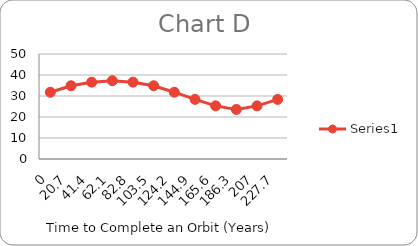
| Category | Series 0 |
|---|---|
| 0.0 | 31.806 |
| 20.7 | 34.884 |
| 41.4 | 36.594 |
| 62.099999999999994 | 37.278 |
| 82.8 | 36.594 |
| 103.5 | 34.884 |
| 124.19999999999999 | 31.806 |
| 144.9 | 28.386 |
| 165.6 | 25.308 |
| 186.29999999999998 | 23.598 |
| 207.0 | 25.308 |
| 227.7 | 28.386 |